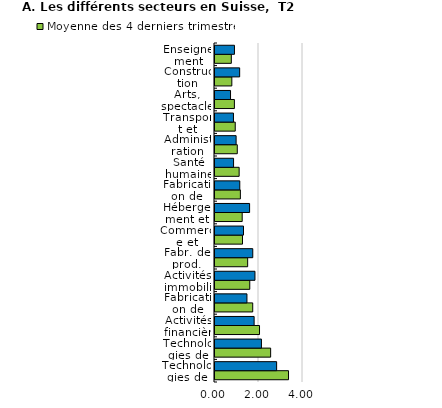
| Category | Moyenne des 4 derniers trimestres | Moyenne des 8 dernières années |
|---|---|---|
| Technologies de l’information et autres services informatiques¹ | 3.342 | 2.801 |
| Technologies de l’information et de la communication | 2.529 | 2.111 |
| Activités financières et d’assurance | 2.024 | 1.779 |
| Fabrication de machines et équipements n.c.a. | 1.715 | 1.452 |
| Activités immobilières et activités spécialisées | 1.581 | 1.817 |
| Fabr. de prod. informatiques, électroniques, optiques ; horlogerie | 1.485 | 1.717 |
| Commerce et réparation d’automobiles et de motocycles | 1.25 | 1.296 |
| Hébergement et restauration | 1.236 | 1.573 |
| Fabrication de produits métalliques | 1.154 | 1.127 |
| Santé humaine et action sociale | 1.098 | 0.844 |
| Administration publique | 1.013 | 0.96 |
| Transport et entreposage | 0.92 | 0.839 |
| Arts, spectacles | 0.882 | 0.706 |
| Construction | 0.766 | 1.121 |
| Enseignement | 0.743 | 0.884 |